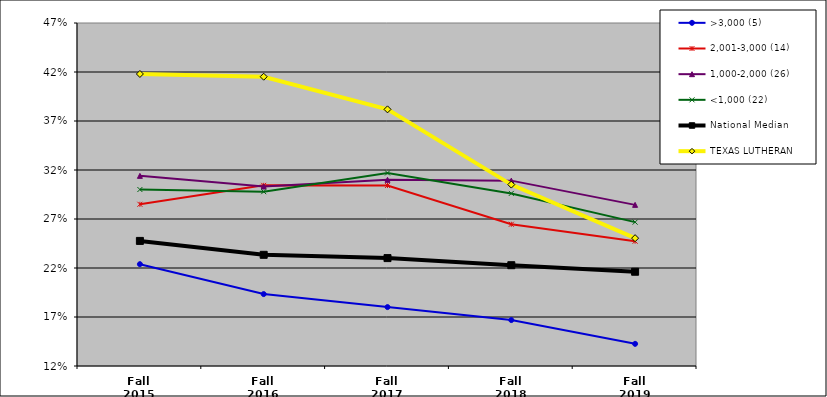
| Category | >3,000 (5) | 2,001-3,000 (14) | 1,000-2,000 (26) | <1,000 (22) | National Median | TEXAS LUTHERAN |
|---|---|---|---|---|---|---|
| Fall 2015 | 0.224 | 0.285 | 0.314 | 0.3 | 0.248 | 0.418 |
| Fall 2016 | 0.193 | 0.304 | 0.303 | 0.298 | 0.233 | 0.415 |
| Fall 2017 | 0.18 | 0.304 | 0.31 | 0.317 | 0.23 | 0.382 |
| Fall 2018 | 0.167 | 0.265 | 0.309 | 0.296 | 0.223 | 0.305 |
| Fall 2019 | 0.143 | 0.247 | 0.284 | 0.267 | 0.216 | 0.25 |